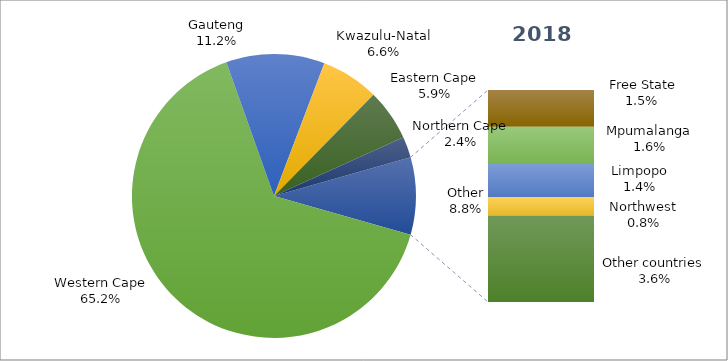
| Category | 2014 |
|---|---|
| Western Cape | 11817 |
| Gauteng | 2035 |
| Kwazulu-Natal | 1193 |
| Eastern Cape | 1063 |
| Northern Cape | 434 |
|  Free State | 276 |
| Mpumalanga | 282 |
| Limpopo | 248 |
| Northwest | 141 |
| Other countries | 649 |